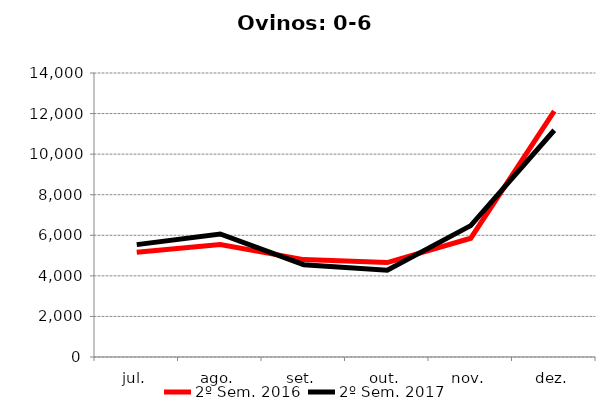
| Category | 2º Sem. 2016 | 2º Sem. 2017 |
|---|---|---|
| jul. | 5168 | 5539 |
| ago. | 5545 | 6063 |
| set. | 4801 | 4550 |
| out. | 4657 | 4280 |
| nov. | 5854 | 6477 |
| dez. | 12120 | 11177 |